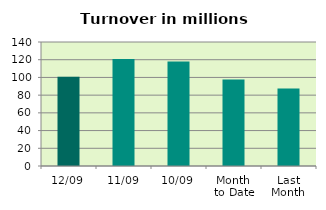
| Category | Series 0 |
|---|---|
| 12/09 | 100.673 |
| 11/09 | 120.771 |
| 10/09 | 118.03 |
| Month 
to Date | 97.677 |
| Last
Month | 87.619 |